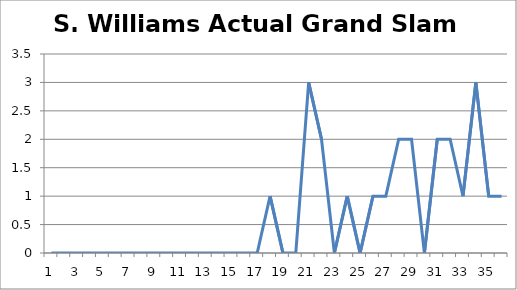
| Category | S. Williams Actual Grand Slam Titles |
|---|---|
| 0 | 0 |
| 1 | 0 |
| 2 | 0 |
| 3 | 0 |
| 4 | 0 |
| 5 | 0 |
| 6 | 0 |
| 7 | 0 |
| 8 | 0 |
| 9 | 0 |
| 10 | 0 |
| 11 | 0 |
| 12 | 0 |
| 13 | 0 |
| 14 | 0 |
| 15 | 0 |
| 16 | 0 |
| 17 | 1 |
| 18 | 0 |
| 19 | 0 |
| 20 | 3 |
| 21 | 2 |
| 22 | 0 |
| 23 | 1 |
| 24 | 0 |
| 25 | 1 |
| 26 | 1 |
| 27 | 2 |
| 28 | 2 |
| 29 | 0 |
| 30 | 2 |
| 31 | 2 |
| 32 | 1 |
| 33 | 3 |
| 34 | 1 |
| 35 | 1 |